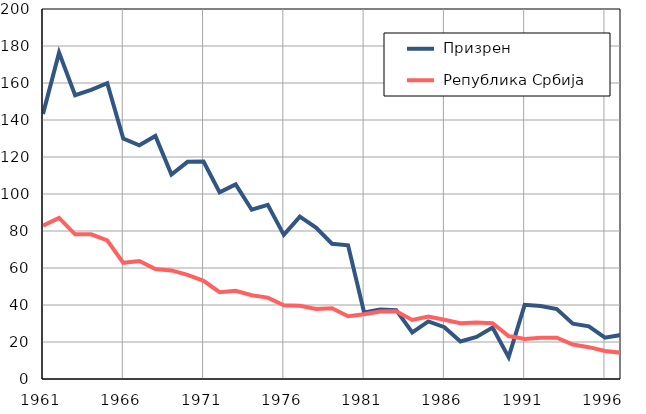
| Category |  Призрен |  Република Србија |
|---|---|---|
| 1961.0 | 143.3 | 82.9 |
| 1962.0 | 176.4 | 87.1 |
| 1963.0 | 153.4 | 78.2 |
| 1964.0 | 156.3 | 78.2 |
| 1965.0 | 159.9 | 74.9 |
| 1966.0 | 130 | 62.8 |
| 1967.0 | 126.3 | 63.8 |
| 1968.0 | 131.4 | 59.4 |
| 1969.0 | 110.5 | 58.7 |
| 1970.0 | 117.4 | 56.3 |
| 1971.0 | 117.5 | 53.1 |
| 1972.0 | 100.9 | 46.9 |
| 1973.0 | 105.2 | 47.7 |
| 1974.0 | 91.5 | 45.3 |
| 1975.0 | 94.1 | 44 |
| 1976.0 | 77.9 | 39.9 |
| 1977.0 | 87.8 | 39.6 |
| 1978.0 | 81.9 | 37.8 |
| 1979.0 | 73.1 | 38.2 |
| 1980.0 | 72.3 | 33.9 |
| 1981.0 | 36 | 35 |
| 1982.0 | 37.5 | 36.5 |
| 1983.0 | 37.2 | 36.6 |
| 1984.0 | 25.2 | 31.9 |
| 1985.0 | 31.1 | 33.7 |
| 1986.0 | 28 | 32 |
| 1987.0 | 20.3 | 30.2 |
| 1988.0 | 22.7 | 30.5 |
| 1989.0 | 27.8 | 30.2 |
| 1990.0 | 11.8 | 23.2 |
| 1991.0 | 40.1 | 21.6 |
| 1992.0 | 39.5 | 22.3 |
| 1993.0 | 37.8 | 22.3 |
| 1994.0 | 29.9 | 18.6 |
| 1995.0 | 28.5 | 17.2 |
| 1996.0 | 22.3 | 15.1 |
| 1997.0 | 23.8 | 14.2 |